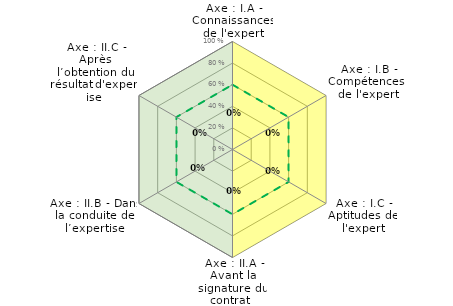
| Category | Couleur confiance | Couleur Capacité | Seuil conformité | Résultats |
|---|---|---|---|---|
| Axe : I.A - Connaissances de l'expert | 1 | 1 | 0.6 | 0 |
| Axe : I.B - Compétences  de l'expert | 0 | 1 | 0.6 | 0 |
| Axe : I.C - Aptitudes de l'expert | 0 | 1 | 0.6 | 0 |
| Axe : II.A - Avant la signature du contrat   | 1 | 1 | 0.6 | 0 |
| Axe : II.B - Dans la conduite de l’expertise | 1 | 0 | 0.6 | 0 |
| Axe : II.C - Après l’obtention du résultat d'expertise | 1 | 0 | 0.6 | 0 |